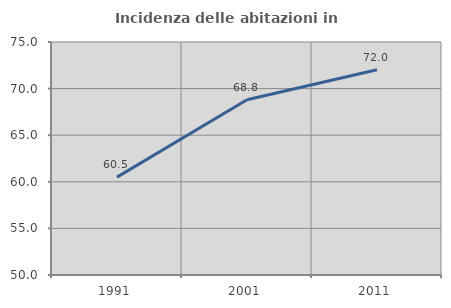
| Category | Incidenza delle abitazioni in proprietà  |
|---|---|
| 1991.0 | 60.503 |
| 2001.0 | 68.811 |
| 2011.0 | 72.016 |